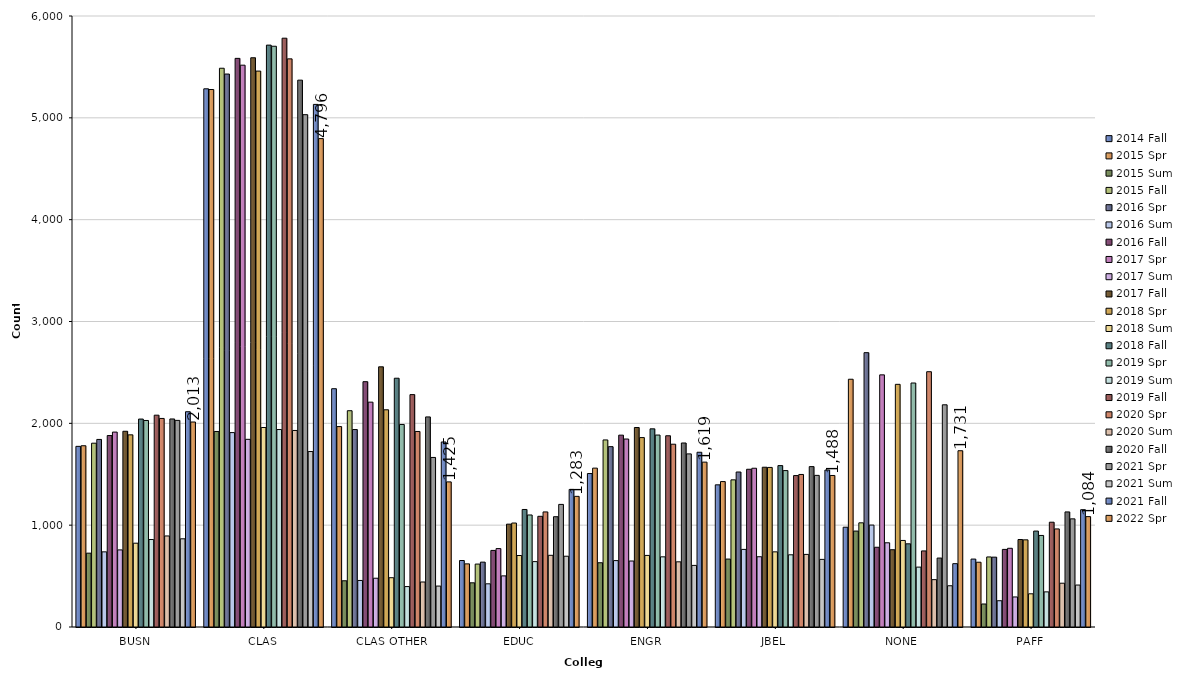
| Category | 2014 Fall | 2015 Spr | 2015 Sum | 2015 Fall | 2016 Spr | 2016 Sum | 2016 Fall | 2017 Spr | 2017 Sum | 2017 Fall | 2018 Spr | 2018 Sum | 2018 Fall | 2019 Spr | 2019 Sum | 2019 Fall | 2020 Spr | 2020 Sum | 2020 Fall | 2021 Spr | 2021 Sum | 2021 Fall | 2022 Spr |
|---|---|---|---|---|---|---|---|---|---|---|---|---|---|---|---|---|---|---|---|---|---|---|---|
| BUSN | 1774 | 1780 | 725 | 1805 | 1842 | 738 | 1880 | 1914 | 757 | 1922 | 1887 | 823 | 2042 | 2028 | 859 | 2080 | 2048 | 894 | 2043 | 2029 | 866 | 2114 | 2013 |
| CLAS | 5285 | 5278 | 1920 | 5487 | 5430 | 1909 | 5584 | 5517 | 1843 | 5590 | 5459 | 1959 | 5714 | 5703 | 1939 | 5782 | 5579 | 1930 | 5370 | 5031 | 1723 | 5132 | 4796 |
| CLAS OTHER | 2340 | 1968 | 454 | 2124 | 1939 | 457 | 2409 | 2208 | 479 | 2555 | 2133 | 484 | 2443 | 1989 | 397 | 2282 | 1920 | 442 | 2063 | 1665 | 402 | 1817 | 1425 |
| EDUC | 653 | 620 | 434 | 618 | 637 | 424 | 752 | 770 | 502 | 1010 | 1021 | 702 | 1154 | 1100 | 642 | 1087 | 1130 | 704 | 1083 | 1204 | 695 | 1351 | 1283 |
| ENGR | 1507 | 1560 | 631 | 1837 | 1771 | 652 | 1884 | 1846 | 648 | 1959 | 1860 | 703 | 1946 | 1885 | 689 | 1878 | 1795 | 640 | 1807 | 1700 | 605 | 1716 | 1619 |
| JBEL | 1396 | 1428 | 667 | 1445 | 1522 | 762 | 1549 | 1559 | 690 | 1569 | 1567 | 738 | 1585 | 1536 | 709 | 1487 | 1498 | 713 | 1575 | 1489 | 664 | 1541 | 1488 |
| NONE | 980 | 2433 | 942 | 1023 | 2694 | 1001 | 783 | 2476 | 827 | 759 | 2383 | 850 | 817 | 2396 | 588 | 747 | 2507 | 465 | 677 | 2182 | 405 | 622 | 1731 |
| PAFF | 667 | 636 | 226 | 688 | 686 | 258 | 762 | 773 | 295 | 859 | 856 | 326 | 942 | 899 | 345 | 1029 | 963 | 430 | 1130 | 1062 | 412 | 1152 | 1084 |